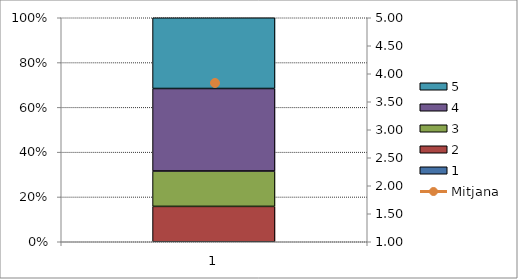
| Category | 1 | 2 | 3 | 4 | 5 |
|---|---|---|---|---|---|
| 0 | 0 | 3 | 3 | 7 | 6 |